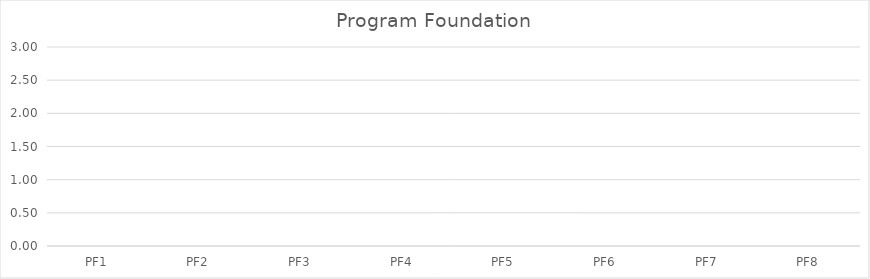
| Category | Series 0 |
|---|---|
| PF1 | 0 |
| PF2 | 0 |
| PF3 | 0 |
| PF4 | 0 |
| PF5 | 0 |
| PF6 | 0 |
| PF7 | 0 |
| PF8 | 0 |